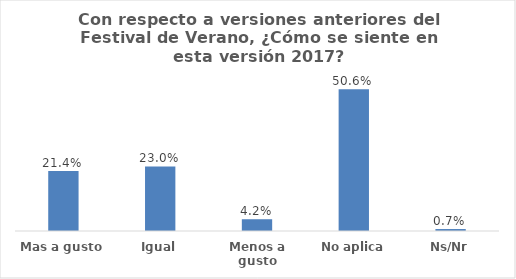
| Category | Series 0 |
|---|---|
| Mas a gusto | 0.214 |
| Igual | 0.23 |
| Menos a gusto | 0.042 |
| No aplica | 0.506 |
| Ns/Nr | 0.007 |